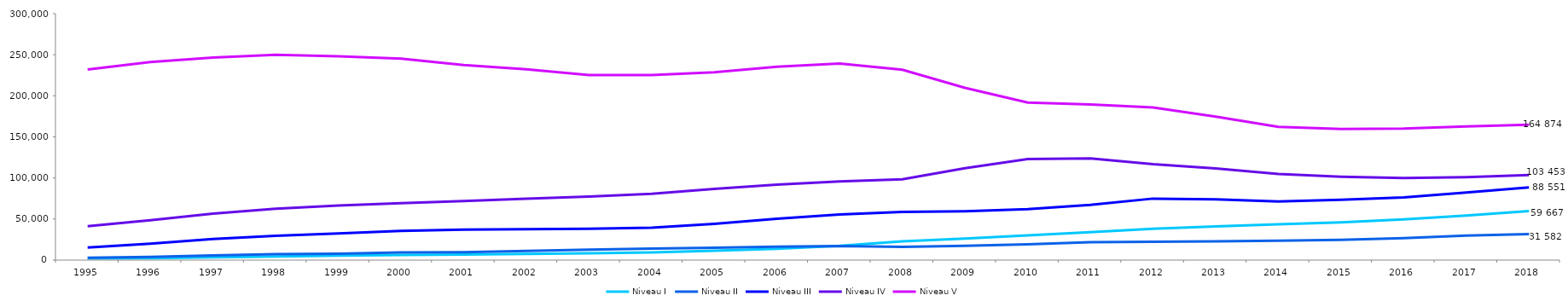
| Category | Niveau I | Niveau II | Niveau III | Niveau IV | Niveau V |
|---|---|---|---|---|---|
| 1995 | 1948 | 2829 | 15273 | 41327 | 232062 |
| 1996 | 2441 | 3916 | 19952 | 48438 | 241182 |
| 1997 | 3250 | 5768 | 25603 | 56579 | 246490 |
| 1998 | 4436 | 7143 | 29581 | 62622 | 249850 |
| 1999 | 5397 | 7780 | 32507 | 66469 | 248084 |
| 2000 | 6185 | 9448 | 35553 | 69355 | 245333 |
| 2001 | 6852 | 9568 | 37234 | 71828 | 237446 |
| 2002 | 7514 | 11243 | 37751 | 74802 | 232166 |
| 2003 | 8378 | 12674 | 38217 | 77362 | 225335 |
| 2004 | 9407 | 14124 | 39560 | 80623 | 225274 |
| 2005 | 11341 | 15063 | 44233 | 86609 | 228613 |
| 2006 | 13690 | 16461 | 50316 | 91951 | 235391 |
| 2007 | 17340 | 17198 | 55577 | 95753 | 239294 |
| 2008 | 22928 | 16021 | 58572 | 98470 | 231659 |
| 2009 | 26156 | 17387 | 59532 | 111900 | 209767 |
| 2010 | 30142 | 19189 | 62074 | 123018 | 191857 |
| 2011 | 33931 | 21762 | 67193 | 123888 | 189560 |
| 2012 | 38182 | 22321 | 74868 | 116897 | 185875 |
| 2013 | 41027 | 22937 | 74048 | 111682 | 174654 |
| 2014 | 43614 | 23743 | 71419 | 104880 | 162226 |
| 2015 | 46041 | 24655 | 73317 | 101582 | 159610 |
| 2016 | 49523 | 26605 | 76326 | 99814 | 159998 |
| 2017 | 54364 | 29740 | 82200 | 100952 | 162650 |
| 2018 | 59667 | 31582 | 88551 | 103453 | 164874 |